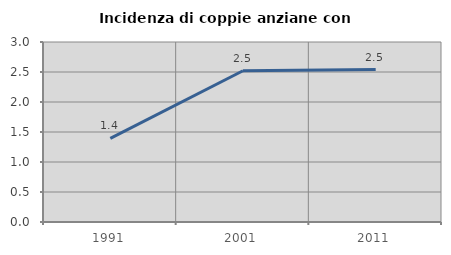
| Category | Incidenza di coppie anziane con figli |
|---|---|
| 1991.0 | 1.393 |
| 2001.0 | 2.521 |
| 2011.0 | 2.54 |